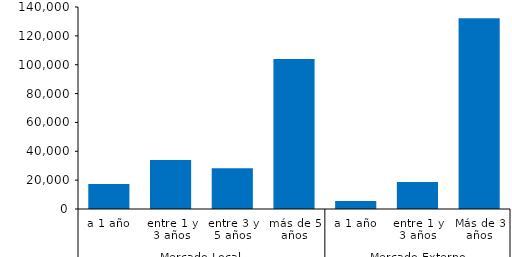
| Category | III |
|---|---|
| 0 | 17397.44 |
| 1 | 33987.812 |
| 2 | 28281.265 |
| 3 | 103992.51 |
| 4 | 5487.215 |
| 5 | 18702.631 |
| 6 | 132219.949 |